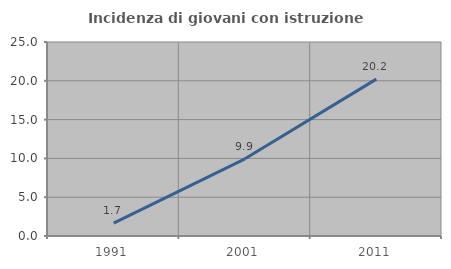
| Category | Incidenza di giovani con istruzione universitaria |
|---|---|
| 1991.0 | 1.667 |
| 2001.0 | 9.945 |
| 2011.0 | 20.213 |